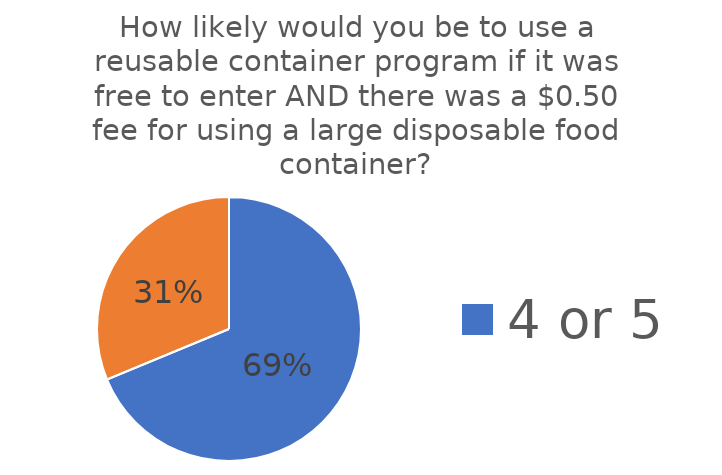
| Category | Series 0 |
|---|---|
| 4 or 5 | 121 |
| 3, 2, or 1 | 55 |